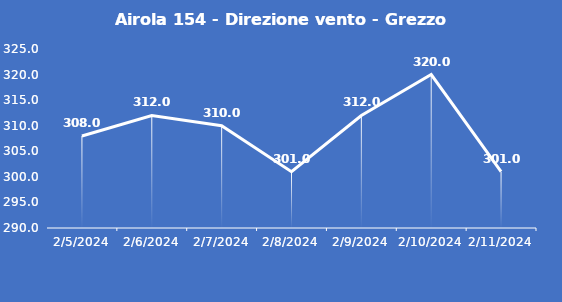
| Category | Airola 154 - Direzione vento - Grezzo (°N) |
|---|---|
| 2/5/24 | 308 |
| 2/6/24 | 312 |
| 2/7/24 | 310 |
| 2/8/24 | 301 |
| 2/9/24 | 312 |
| 2/10/24 | 320 |
| 2/11/24 | 301 |